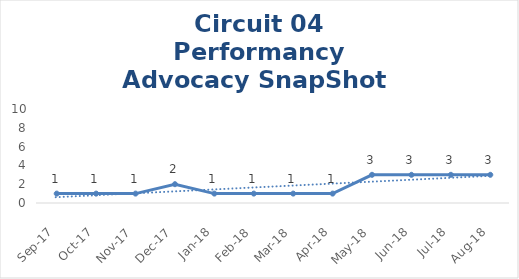
| Category | Circuit 04 |
|---|---|
| Sep-17 | 1 |
| Oct-17 | 1 |
| Nov-17 | 1 |
| Dec-17 | 2 |
| Jan-18 | 1 |
| Feb-18 | 1 |
| Mar-18 | 1 |
| Apr-18 | 1 |
| May-18 | 3 |
| Jun-18 | 3 |
| Jul-18 | 3 |
| Aug-18 | 3 |